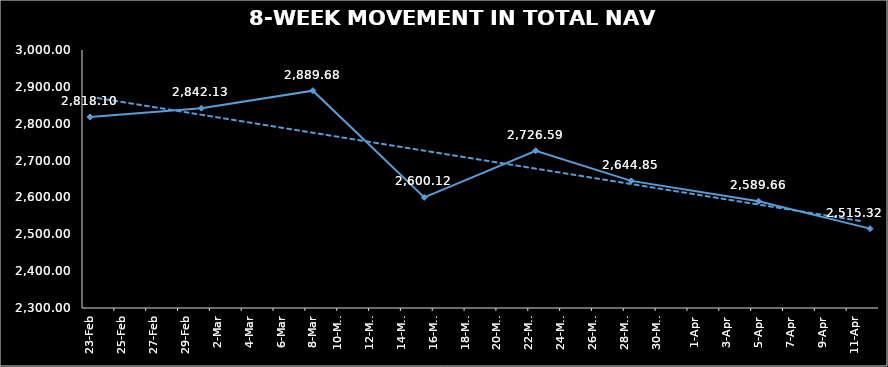
| Category | TOTAL NAV |
|---|---|
| 2024-02-23 | 2818.099 |
| 2024-03-01 | 2842.127 |
| 2024-03-08 | 2889.675 |
| 2024-03-15 | 2600.12 |
| 2024-03-22 | 2726.59 |
| 2024-03-28 | 2644.848 |
| 2024-04-05 | 2589.664 |
| 2024-04-12 | 2515.322 |